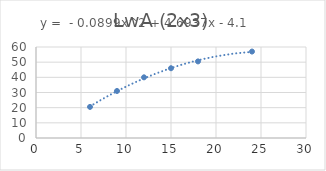
| Category | Series 0 |
|---|---|
| 6.0 | 20.5 |
| 9.0 | 31 |
| 12.0 | 40 |
| 15.0 | 46 |
| 18.0 | 50.5 |
| 24.0 | 57 |